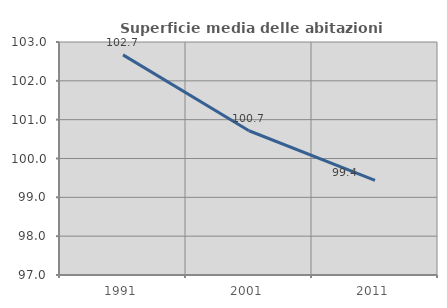
| Category | Superficie media delle abitazioni occupate |
|---|---|
| 1991.0 | 102.669 |
| 2001.0 | 100.715 |
| 2011.0 | 99.438 |